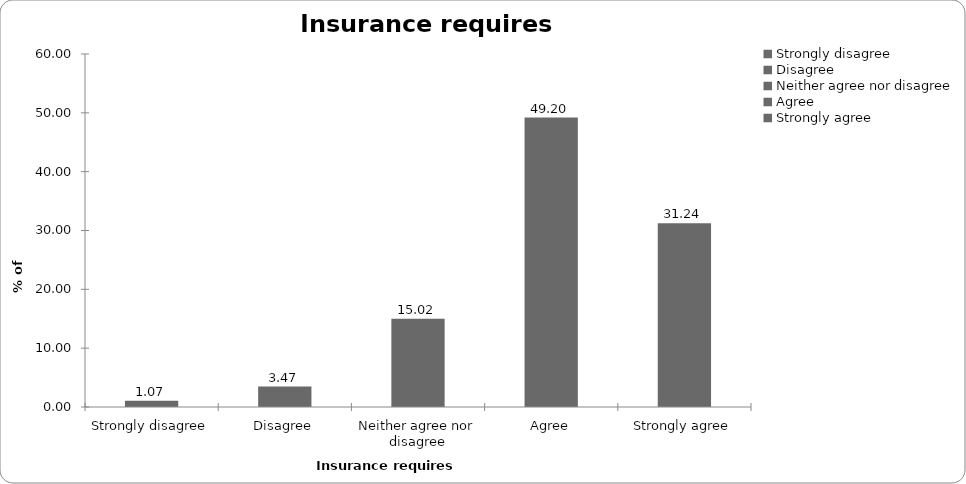
| Category | Insurance requires regulation |
|---|---|
| Strongly disagree | 1.068 |
| Disagree | 3.471 |
| Neither agree nor disagree | 15.02 |
| Agree | 49.199 |
| Strongly agree | 31.242 |